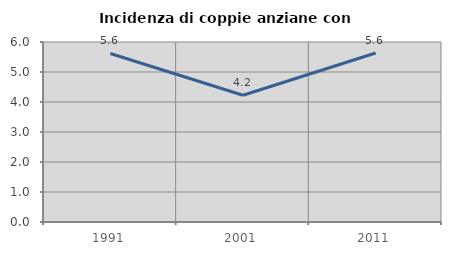
| Category | Incidenza di coppie anziane con figli |
|---|---|
| 1991.0 | 5.618 |
| 2001.0 | 4.225 |
| 2011.0 | 5.634 |